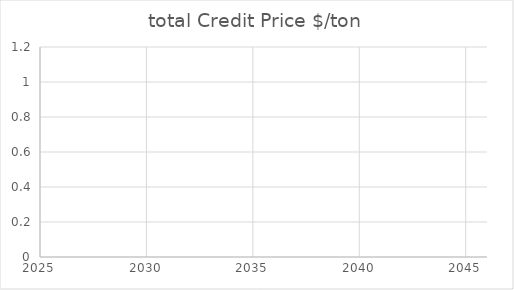
| Category | total Credit Price $/ton |
|---|---|
| 0 | 1 |